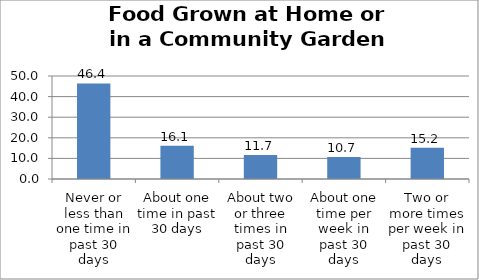
| Category | Series 0 |
|---|---|
| Never or less than one time in past 30 days | 46.374 |
| About one time in past 30 days | 16.107 |
| About two or three times in past 30 days | 11.674 |
| About one time per week in past 30 days | 10.676 |
| Two or more times per week in past 30 days | 15.168 |